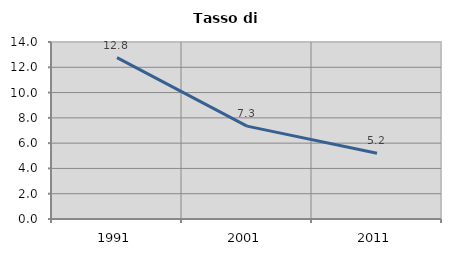
| Category | Tasso di disoccupazione   |
|---|---|
| 1991.0 | 12.762 |
| 2001.0 | 7.344 |
| 2011.0 | 5.204 |